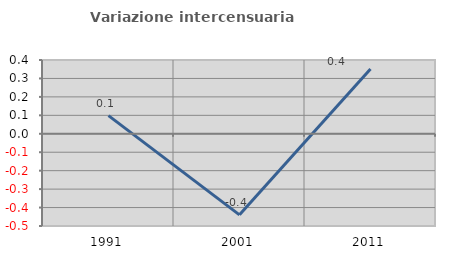
| Category | Variazione intercensuaria annua |
|---|---|
| 1991.0 | 0.098 |
| 2001.0 | -0.44 |
| 2011.0 | 0.352 |